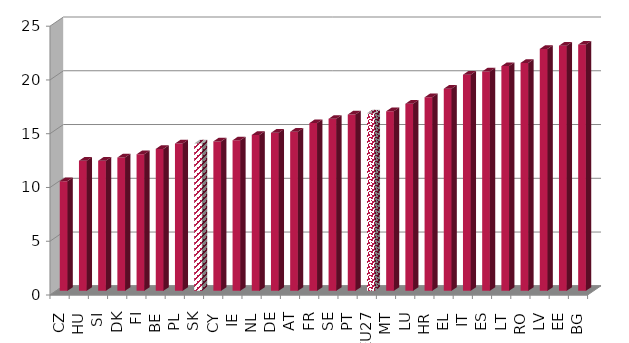
| Category | Series 0 |
|---|---|
| CZ | 10.2 |
| HU | 12.1 |
| SI | 12.1 |
| DK | 12.4 |
| FI | 12.7 |
| BE | 13.2 |
| PL | 13.7 |
| SK | 13.7 |
| CY | 13.9 |
| IE | 14 |
| NL | 14.5 |
| DE | 14.7 |
| AT | 14.8 |
| FR | 15.6 |
| SE | 16 |
| PT | 16.4 |
| EU27 | 16.5 |
| MT | 16.7 |
| LU | 17.4 |
| HR | 18 |
| EL | 18.8 |
| IT | 20.1 |
| ES | 20.4 |
| LT | 20.9 |
| RO | 21.2 |
| LV | 22.5 |
| EE | 22.8 |
| BG | 22.9 |